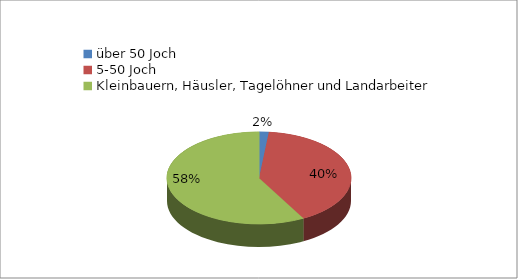
| Category | Die deutsche Agrarbevölkerung 1920 |
|---|---|
| über 50 Joch | 0.017 |
| 5-50 Joch | 0.403 |
| Kleinbauern, Häusler, Tagelöhner und Landarbeiter | 0.58 |